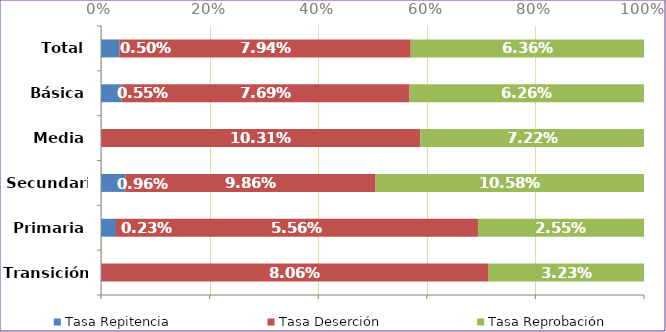
| Category | Tasa Repitencia | Tasa Deserción | Tasa Reprobación |
|---|---|---|---|
| Transición | 0 | 0.081 | 0.032 |
| Primaria | 0.002 | 0.056 | 0.026 |
| Secundaria | 0.01 | 0.099 | 0.106 |
| Media | 0 | 0.103 | 0.072 |
| Básica | 0.006 | 0.077 | 0.063 |
| Total | 0.005 | 0.079 | 0.064 |